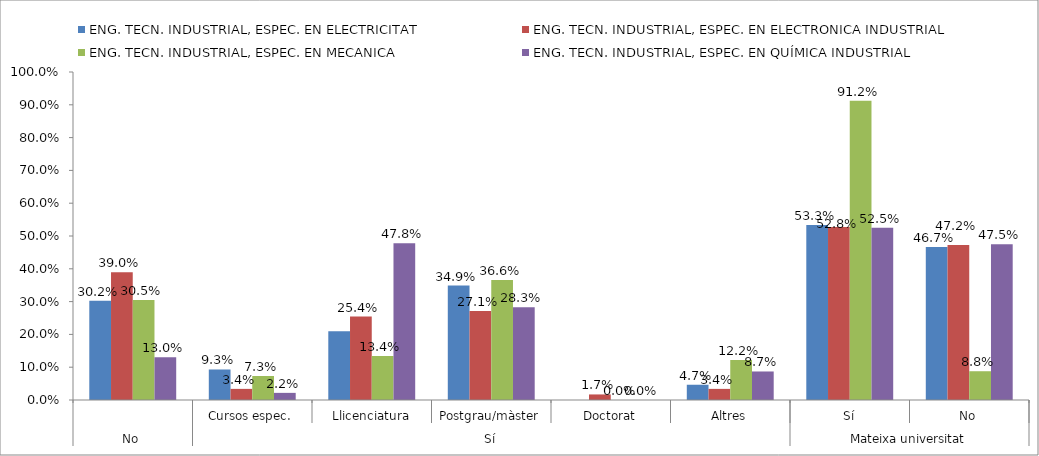
| Category | ENG. TECN. INDUSTRIAL, ESPEC. EN ELECTRICITAT | ENG. TECN. INDUSTRIAL, ESPEC. EN ELECTRONICA INDUSTRIAL | ENG. TECN. INDUSTRIAL, ESPEC. EN MECANICA | ENG. TECN. INDUSTRIAL, ESPEC. EN QUÍMICA INDUSTRIAL |
|---|---|---|---|---|
| 0 | 0.302 | 0.39 | 0.305 | 0.13 |
| 1 | 0.093 | 0.034 | 0.073 | 0.022 |
| 2 | 0.209 | 0.254 | 0.134 | 0.478 |
| 3 | 0.349 | 0.271 | 0.366 | 0.283 |
| 4 | 0 | 0.017 | 0 | 0 |
| 5 | 0.047 | 0.034 | 0.122 | 0.087 |
| 6 | 0.533 | 0.528 | 0.912 | 0.525 |
| 7 | 0.467 | 0.472 | 0.088 | 0.475 |